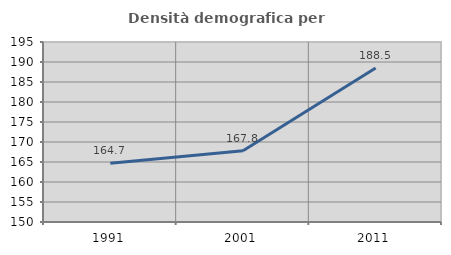
| Category | Densità demografica |
|---|---|
| 1991.0 | 164.685 |
| 2001.0 | 167.806 |
| 2011.0 | 188.508 |